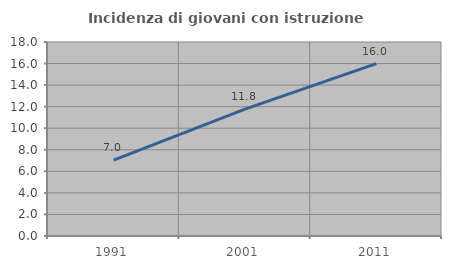
| Category | Incidenza di giovani con istruzione universitaria |
|---|---|
| 1991.0 | 7.031 |
| 2001.0 | 11.765 |
| 2011.0 | 16 |